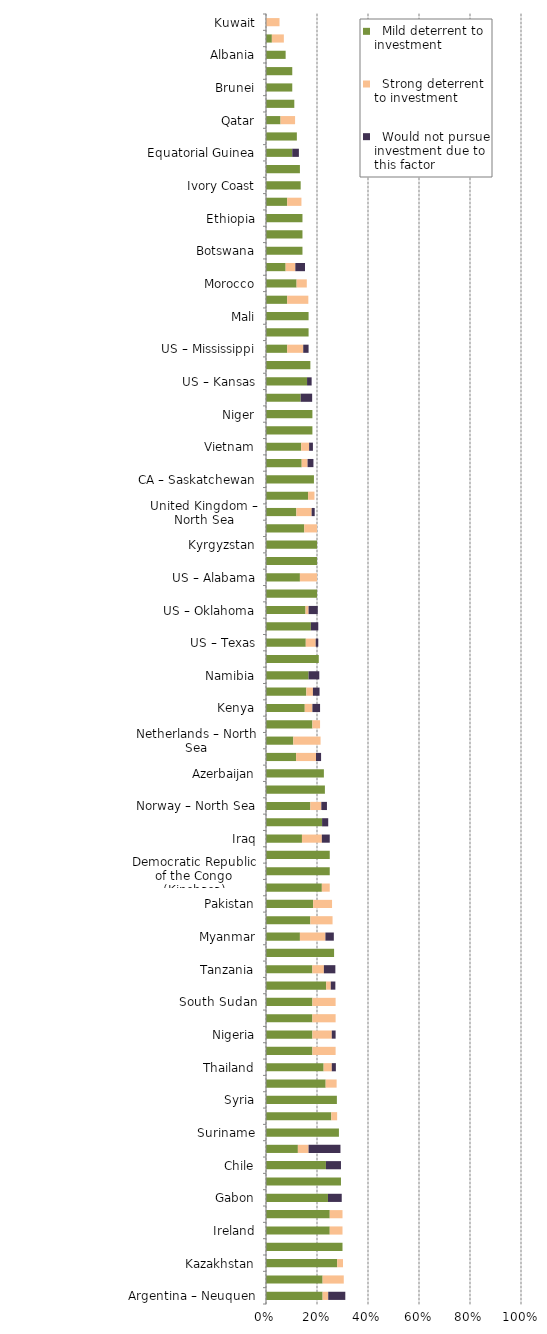
| Category |   Mild deterrent to investment |   Strong deterrent to investment |   Would not pursue investment due to this factor |
|---|---|---|---|
| Argentina – Neuquen | 0.222 | 0.022 | 0.067 |
| Philippines | 0.222 | 0.083 | 0 |
| Kazakhstan | 0.279 | 0.023 | 0 |
| Faroe Islands | 0.3 | 0 | 0 |
| Ireland | 0.25 | 0.05 | 0 |
| Madagascar | 0.25 | 0.05 | 0 |
| Gabon | 0.243 | 0 | 0.054 |
| East Timor | 0.294 | 0 | 0 |
| Chile | 0.235 | 0 | 0.059 |
| Argentina – Tierra del Fuego | 0.125 | 0.042 | 0.125 |
| Suriname | 0.286 | 0 | 0 |
| Trinidad and Tobago | 0.256 | 0.023 | 0 |
| Syria | 0.278 | 0 | 0 |
| Papua New Guinea | 0.234 | 0.043 | 0 |
| Thailand | 0.226 | 0.032 | 0.016 |
| Russia – other | 0.182 | 0.091 | 0 |
| Nigeria | 0.182 | 0.076 | 0.015 |
| Seychelles | 0.182 | 0.091 | 0 |
| South Sudan | 0.182 | 0.091 | 0 |
| Egypt | 0.236 | 0.018 | 0.018 |
| Tanzania | 0.182 | 0.045 | 0.045 |
| Turkmenistan | 0.267 | 0 | 0 |
| Myanmar | 0.133 | 0.1 | 0.033 |
| Poland | 0.174 | 0.087 | 0 |
| Pakistan | 0.185 | 0.074 | 0 |
| China | 0.219 | 0.031 | 0 |
| Democratic Republic of the Congo (Kinshasa) | 0.25 | 0 | 0 |
| Republic of the Congo (Brazzaville) | 0.25 | 0 | 0 |
| Iraq | 0.141 | 0.078 | 0.031 |
| Angola | 0.22 | 0 | 0.024 |
| Norway – North Sea | 0.174 | 0.043 | 0.022 |
| Guyana | 0.231 | 0 | 0 |
| Azerbaijan | 0.227 | 0 | 0 |
| Libya | 0.118 | 0.078 | 0.02 |
| Netherlands – North Sea | 0.107 | 0.107 | 0 |
| US – North Dakota | 0.182 | 0.03 | 0 |
| Kenya | 0.152 | 0.03 | 0.03 |
| Tunisia | 0.158 | 0.026 | 0.026 |
| Namibia | 0.167 | 0 | 0.042 |
| CA – Newfoundland & Labrador | 0.207 | 0 | 0 |
| US – Texas | 0.156 | 0.039 | 0.01 |
| Mozambique | 0.176 | 0 | 0.029 |
| US – Oklahoma | 0.155 | 0.012 | 0.036 |
| CA – Manitoba | 0.2 | 0 | 0 |
| US – Alabama | 0.133 | 0.067 | 0 |
| Denmark | 0.2 | 0 | 0 |
| Kyrgyzstan | 0.2 | 0 | 0 |
| Israel | 0.15 | 0.05 | 0 |
| United Kingdom – North Sea | 0.119 | 0.06 | 0.012 |
| Malaysia | 0.165 | 0.025 | 0 |
| CA – Saskatchewan | 0.188 | 0 | 0 |
| Ghana | 0.14 | 0.023 | 0.023 |
| Vietnam | 0.138 | 0.031 | 0.015 |
| US – Arkansas | 0.182 | 0 | 0 |
| Niger | 0.182 | 0 | 0 |
| Cyprus | 0.136 | 0 | 0.045 |
| US – Kansas | 0.161 | 0 | 0.018 |
| US – West Virginia | 0.174 | 0 | 0 |
| US – Mississippi | 0.083 | 0.063 | 0.021 |
| Georgia | 0.167 | 0 | 0 |
| Mali | 0.167 | 0 | 0 |
| Mauritania | 0.083 | 0.083 | 0 |
| Morocco | 0.12 | 0.04 | 0 |
| CA – Nova Scotia | 0.077 | 0.038 | 0.038 |
| Botswana | 0.143 | 0 | 0 |
| Chad | 0.143 | 0 | 0 |
| Ethiopia | 0.143 | 0 | 0 |
| Algeria | 0.083 | 0.056 | 0 |
| Ivory Coast | 0.136 | 0 | 0 |
| Bahrain | 0.133 | 0 | 0 |
| Equatorial Guinea | 0.103 | 0 | 0.026 |
| Oman | 0.121 | 0 | 0 |
| Qatar | 0.057 | 0.057 | 0 |
| Jordan | 0.111 | 0 | 0 |
| Brunei | 0.103 | 0 | 0 |
| Yemen | 0.103 | 0 | 0 |
| Albania | 0.077 | 0 | 0 |
| United Arab Emirates | 0.023 | 0.047 | 0 |
| Kuwait | 0 | 0.053 | 0 |